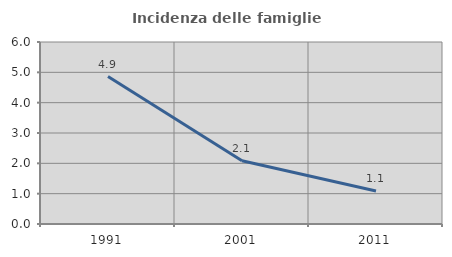
| Category | Incidenza delle famiglie numerose |
|---|---|
| 1991.0 | 4.861 |
| 2001.0 | 2.083 |
| 2011.0 | 1.087 |